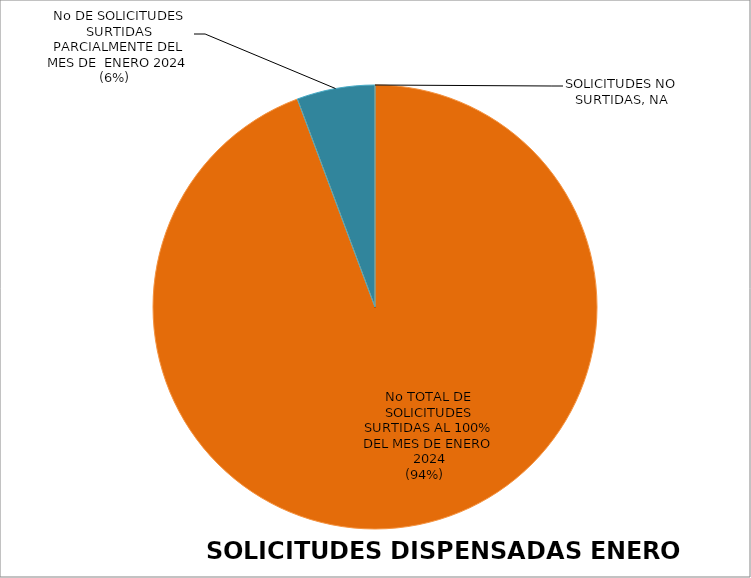
| Category | Series 0 |
|---|---|
| No TOTAL DE SOLICITUDES SURTIDAS AL 100% DEL MES DE ENERO 2024 | 14903 |
| No DE SOLICITUDES SURTIDAS PARCIALMENTE DEL MES DE  ENERO 2024 | 899 |
| SOLICITUDES NO SURTIDAS | 0 |